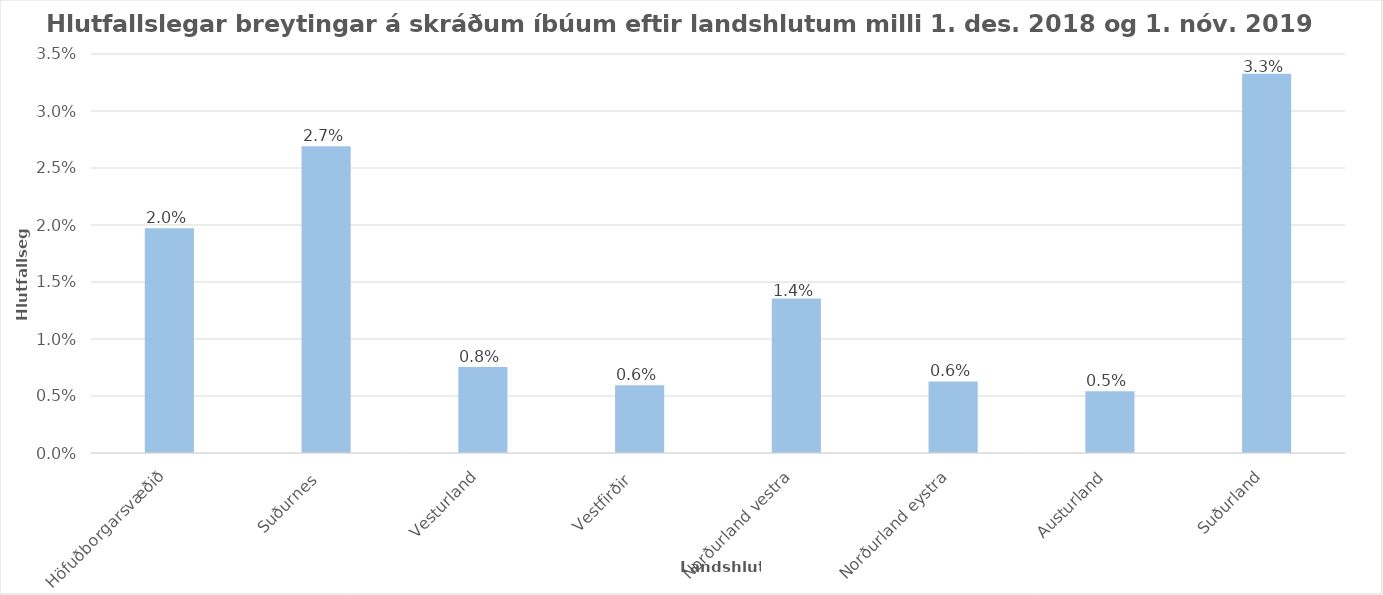
| Category | Series 0 |
|---|---|
| Höfuðborgarsvæðið | 0.02 |
| Suðurnes  | 0.027 |
| Vesturland | 0.008 |
| Vestfirðir  | 0.006 |
| Norðurland vestra | 0.014 |
| Norðurland eystra | 0.006 |
| Austurland | 0.005 |
| Suðurland | 0.033 |